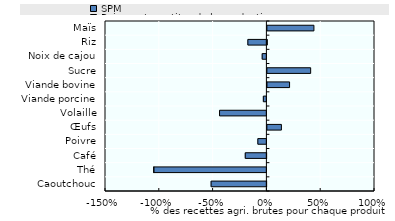
| Category | SPM | Paiements au titre de la production | Autres transferts au titre d'un seul produit |
|---|---|---|---|
| Caoutchouc | -0.518 | 0 | 0 |
| Thé | -1.05 | 0 | 0 |
| Café | -0.201 | 0 | 0 |
| Poivre | -0.084 | 0 | 0 |
| Œufs | 0.139 | 0 | 0 |
| Volaille | -0.44 | 0 | 0 |
| Viande porcine | -0.033 | 0 | 0 |
| Viande bovine | 0.215 | 0 | 0 |
| Sucre | 0.411 | 0 | 0 |
| Noix de cajou | -0.044 | 0 | 0 |
| Riz | -0.177 | 0 | 0.008 |
| Maïs | 0.442 | 0 | 0 |